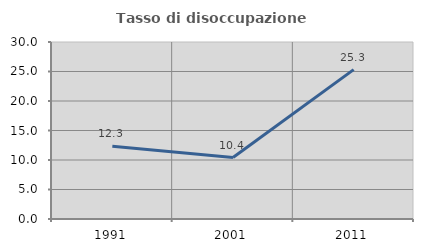
| Category | Tasso di disoccupazione giovanile  |
|---|---|
| 1991.0 | 12.311 |
| 2001.0 | 10.412 |
| 2011.0 | 25.319 |